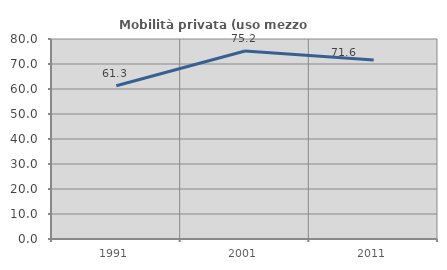
| Category | Mobilità privata (uso mezzo privato) |
|---|---|
| 1991.0 | 61.321 |
| 2001.0 | 75.221 |
| 2011.0 | 71.642 |